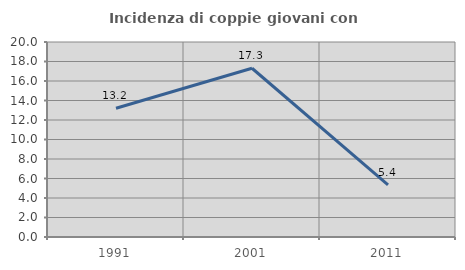
| Category | Incidenza di coppie giovani con figli |
|---|---|
| 1991.0 | 13.208 |
| 2001.0 | 17.308 |
| 2011.0 | 5.357 |